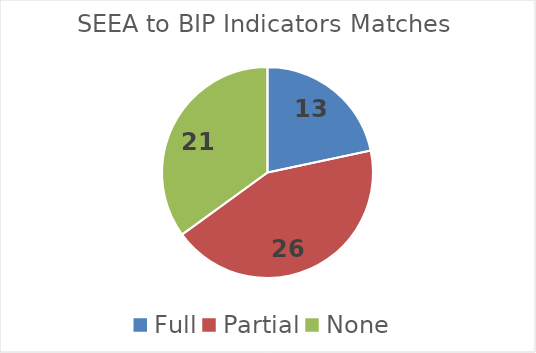
| Category | Series 0 |
|---|---|
| Full | 13 |
| Partial | 26 |
| None | 21 |